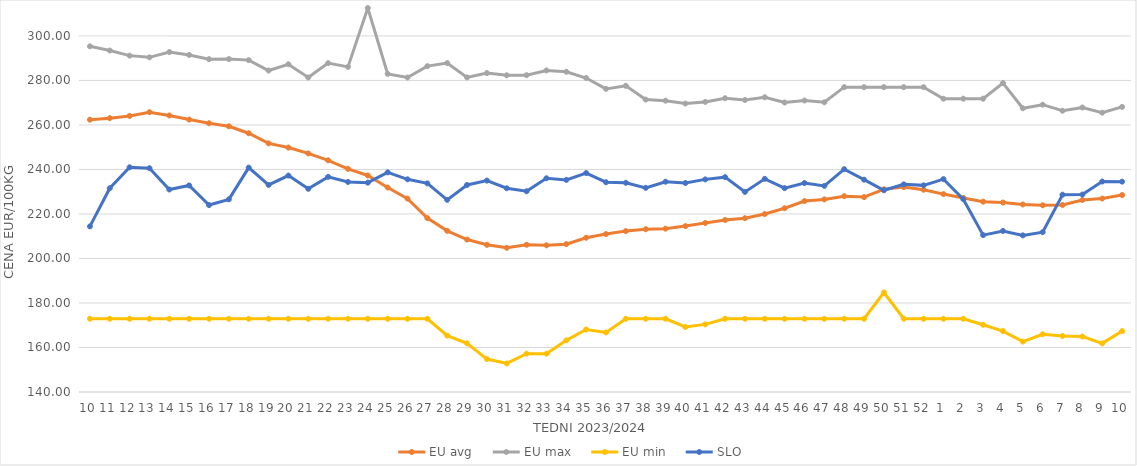
| Category | EU avg | EU max | EU min | SLO |
|---|---|---|---|---|
| 10.0 | 262.352 | 295.33 | 172.91 | 214.42 |
| 11.0 | 263.049 | 293.44 | 172.91 | 231.56 |
| 12.0 | 264.068 | 291.15 | 172.91 | 240.97 |
| 13.0 | 265.73 | 290.38 | 172.91 | 240.55 |
| 14.0 | 264.262 | 292.763 | 172.91 | 230.99 |
| 15.0 | 262.411 | 291.46 | 172.91 | 232.82 |
| 16.0 | 260.77 | 289.56 | 172.91 | 224 |
| 17.0 | 259.395 | 289.61 | 172.91 | 226.57 |
| 18.0 | 256.275 | 289.13 | 172.91 | 240.83 |
| 19.0 | 251.716 | 284.45 | 172.91 | 233.05 |
| 20.0 | 249.836 | 287.26 | 172.91 | 237.25 |
| 21.0 | 247.212 | 281.33 | 172.91 | 231.3 |
| 22.0 | 244.103 | 287.77 | 172.91 | 236.67 |
| 23.0 | 240.279 | 286.1 | 172.91 | 234.39 |
| 24.0 | 237.289 | 312.54 | 172.91 | 234.08 |
| 25.0 | 231.895 | 282.95 | 172.91 | 238.69 |
| 26.0 | 226.903 | 281.34 | 172.91 | 235.57 |
| 27.0 | 218.126 | 286.43 | 172.91 | 233.75 |
| 28.0 | 212.406 | 287.8 | 165.32 | 226.35 |
| 29.0 | 208.504 | 281.37 | 161.87 | 233.03 |
| 30.0 | 206.149 | 283.3 | 154.8 | 235 |
| 31.0 | 204.79 | 282.32 | 152.83 | 231.55 |
| 32.0 | 206.16 | 282.36 | 157.23 | 230.2 |
| 33.0 | 205.917 | 284.5 | 157.23 | 236.04 |
| 34.0 | 206.436 | 283.9 | 163.21 | 235.32 |
| 35.0 | 209.326 | 281.09 | 168.085 | 238.39 |
| 36.0 | 210.957 | 276.21 | 166.745 | 234.27 |
| 37.0 | 212.325 | 277.59 | 172.91 | 234 |
| 38.0 | 213.132 | 271.4 | 172.91 | 231.74 |
| 39.0 | 213.398 | 270.91 | 172.91 | 234.5 |
| 40.0 | 214.548 | 269.62 | 169.209 | 233.92 |
| 41.0 | 215.966 | 270.36 | 170.387 | 235.54 |
| 42.0 | 217.294 | 271.99 | 172.91 | 236.54 |
| 43.0 | 218.091 | 271.22 | 172.91 | 229.92 |
| 44.0 | 219.965 | 272.45 | 172.91 | 235.77 |
| 45.0 | 222.584 | 270.09 | 172.91 | 231.6 |
| 46.0 | 225.795 | 270.99 | 172.91 | 233.89 |
| 47.0 | 226.547 | 270.18 | 172.91 | 232.62 |
| 48.0 | 227.993 | 276.99 | 172.91 | 240.11 |
| 49.0 | 227.575 | 276.99 | 172.91 | 235.41 |
| 50.0 | 231.099 | 276.99 | 184.72 | 230.65 |
| 51.0 | 232.088 | 276.99 | 172.91 | 233.3 |
| 52.0 | 230.884 | 276.99 | 172.91 | 232.85 |
| 1.0 | 228.928 | 271.8 | 172.91 | 235.66 |
| 2.0 | 227.213 | 271.8 | 172.91 | 226.65 |
| 3.0 | 225.533 | 271.8 | 170.2 | 210.5 |
| 4.0 | 225.142 | 278.81 | 167.37 | 212.37 |
| 5.0 | 224.262 | 267.49 | 162.66 | 210.38 |
| 6.0 | 223.902 | 269.11 | 165.95 | 211.82 |
| 7.0 | 224.031 | 266.38 | 165.18 | 228.66 |
| 8.0 | 226.285 | 267.85 | 164.92 | 228.73 |
| 9.0 | 226.925 | 265.51 | 161.84 | 234.57 |
| 10.0 | 228.496 | 268.11 | 167.35 | 234.52 |